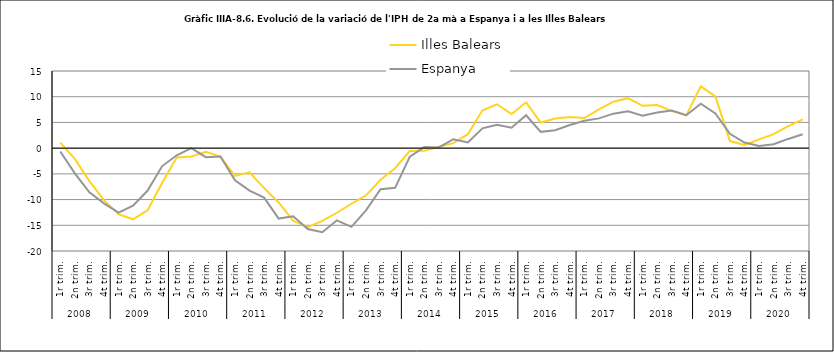
| Category | Illes Balears | Espanya |
|---|---|---|
| 0 | 1.073 | -0.651 |
| 1 | -2.079 | -4.91 |
| 2 | -6.421 | -8.589 |
| 3 | -10.109 | -10.738 |
| 4 | -12.835 | -12.538 |
| 5 | -13.837 | -11.174 |
| 6 | -12.066 | -8.25 |
| 7 | -6.731 | -3.485 |
| 8 | -1.804 | -1.384 |
| 9 | -1.632 | -0.012 |
| 10 | -0.731 | -1.763 |
| 11 | -1.641 | -1.626 |
| 12 | -5.401 | -6.27 |
| 13 | -4.702 | -8.271 |
| 14 | -7.762 | -9.609 |
| 15 | -10.557 | -13.697 |
| 16 | -14.128 | -13.252 |
| 17 | -15.345 | -15.72 |
| 18 | -14.161 | -16.362 |
| 19 | -12.563 | -14.04 |
| 20 | -10.813 | -15.298 |
| 21 | -9.177 | -12.109 |
| 22 | -6.139 | -8.003 |
| 23 | -3.905 | -7.723 |
| 24 | -0.564 | -1.727 |
| 25 | -0.527 | 0.233 |
| 26 | 0.28 | 0.143 |
| 27 | 0.97 | 1.741 |
| 28 | 2.707 | 1.104 |
| 29 | 7.351 | 3.844 |
| 30 | 8.529 | 4.533 |
| 31 | 6.647 | 3.966 |
| 32 | 8.909 | 6.392 |
| 33 | 4.971 | 3.166 |
| 34 | 5.746 | 3.496 |
| 35 | 6.049 | 4.506 |
| 36 | 5.843 | 5.315 |
| 37 | 7.553 | 5.785 |
| 38 | 9.034 | 6.706 |
| 39 | 9.718 | 7.165 |
| 40 | 8.224 | 6.322 |
| 41 | 8.391 | 6.938 |
| 42 | 7.243 | 7.303 |
| 43 | 6.372 | 6.408 |
| 44 | 12.022 | 8.632 |
| 45 | 10.051 | 6.732 |
| 46 | 1.371 | 2.775 |
| 47 | 0.63 | 1.094 |
| 48 | 1.703 | 0.403 |
| 49 | 2.719 | 0.762 |
| 50 | 4.293 | 1.792 |
| 51 | 5.605 | 2.714 |